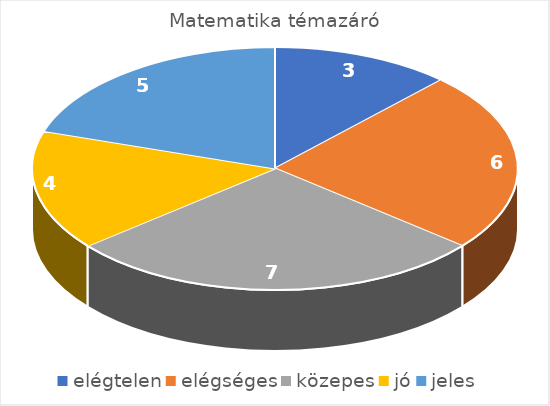
| Category | Series 0 |
|---|---|
| elégtelen | 3 |
| elégséges | 6 |
| közepes | 7 |
| jó | 4 |
| jeles | 5 |